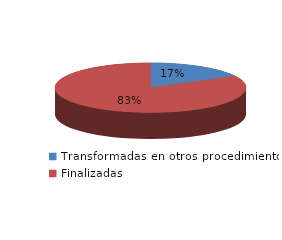
| Category | Series 0 |
|---|---|
| Transformadas en otros procedimientos | 1707 |
| Finalizadas | 8245 |